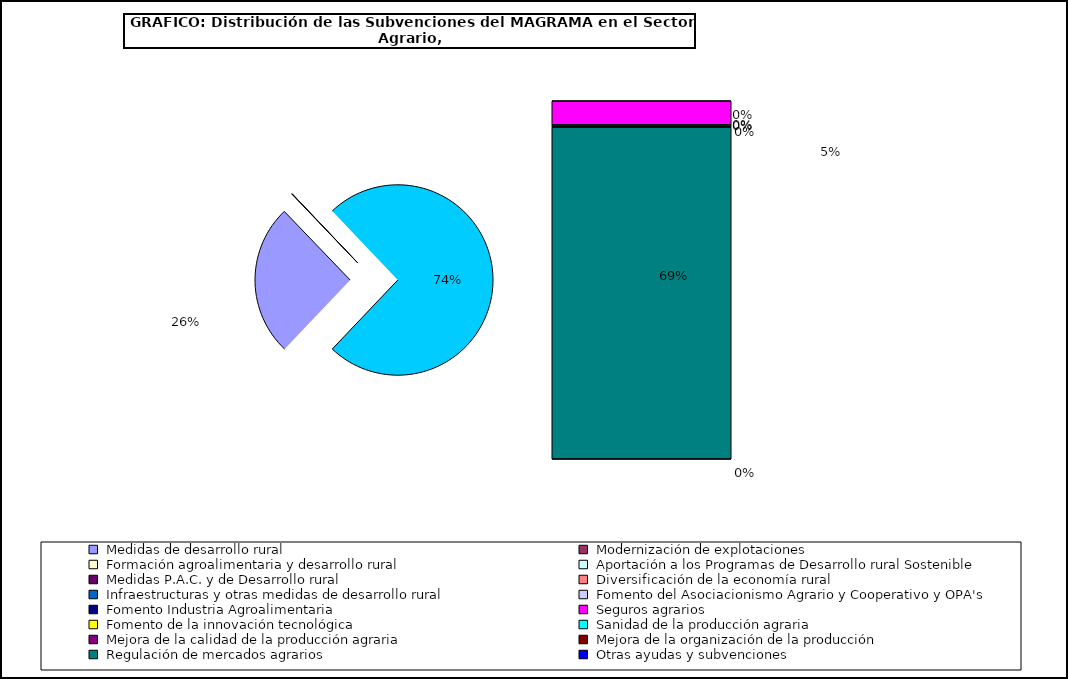
| Category | Series 0 |
|---|---|
|  Medidas de desarrollo rural | 1518424.359 |
|  Modernización de explotaciones | 2239.881 |
|  Formación agroalimentaria y desarrollo rural | 2752.584 |
|  Aportación a los Programas de Desarrollo rural Sostenible | 0 |
|  Medidas P.A.C. y de Desarrollo rural | 0 |
|  Diversificación de la economía rural | 112.835 |
|  Infraestructuras y otras medidas de desarrollo rural | 0 |
|  Fomento del Asociacionismo Agrario y Cooperativo y OPA's | 2632.912 |
|  Fomento Industria Agroalimentaria  | 863.873 |
|  Seguros agrarios | 286504.255 |
|  Fomento de la innovación tecnológica  | 187.091 |
|  Sanidad de la producción agraria | 14233.137 |
|  Mejora de la calidad de la producción agraria | 9927.091 |
|  Mejora de la organización de la producción | 7530.569 |
|  Regulación de mercados agrarios | 4053597.043 |
|  Otras ayudas y subvenciones | 279.118 |